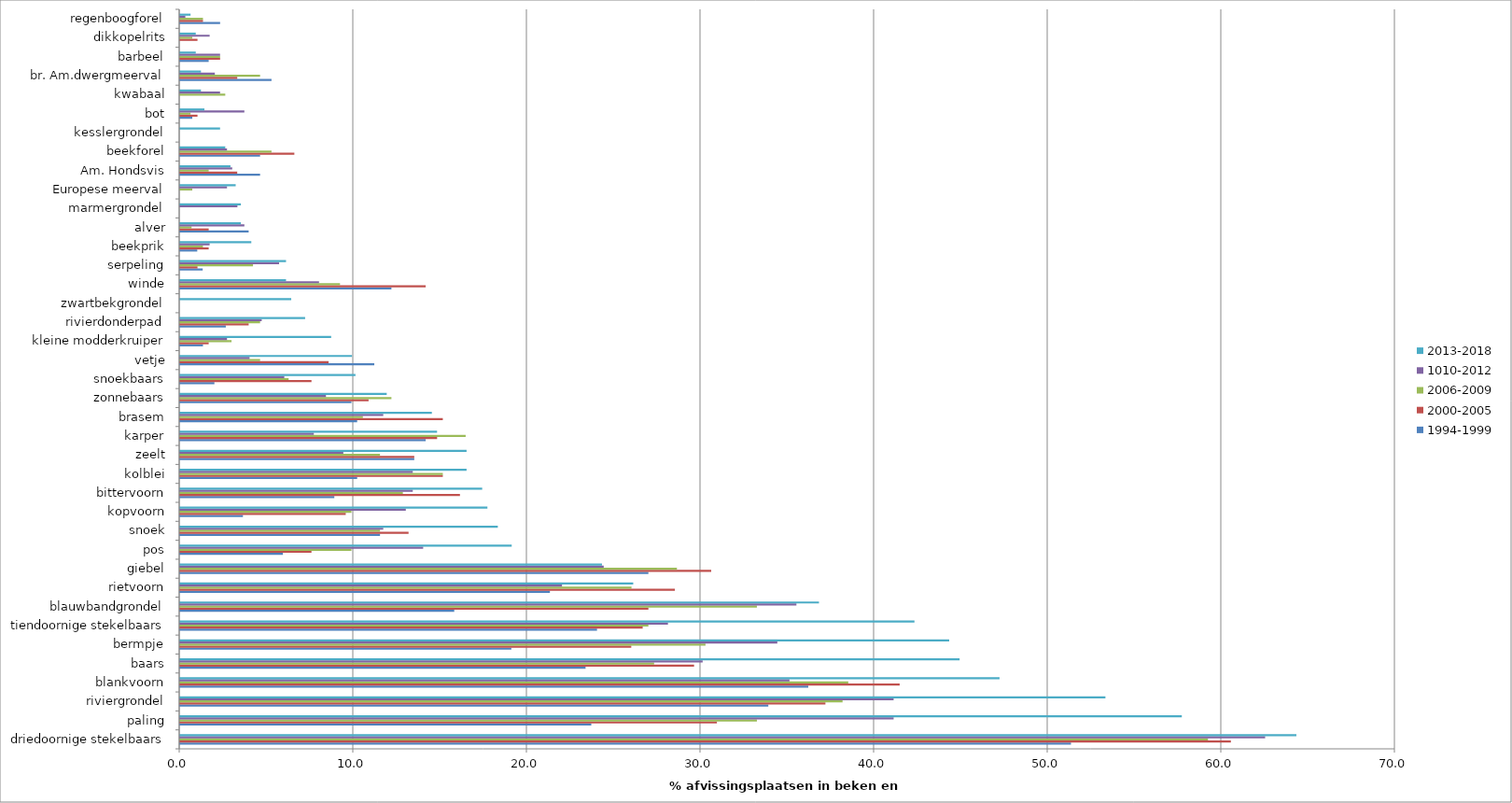
| Category | 1994-1999 | 2000-2005 | 2006-2009 | 1010-2012 | 2013-2018 |
|---|---|---|---|---|---|
| driedoornige stekelbaars | 51.316 | 60.526 | 59.211 | 62.5 | 64.3 |
| paling | 23.684 | 30.921 | 33.224 | 41.1 | 57.7 |
| riviergrondel | 33.882 | 37.171 | 38.158 | 41.1 | 53.3 |
| blankvoorn | 36.184 | 41.447 | 38.487 | 35.1 | 47.2 |
| baars | 23.355 | 29.605 | 27.303 | 30.1 | 44.9 |
| bermpje | 19.079 | 25.987 | 30.263 | 34.4 | 44.3 |
| tiendoornige stekelbaars | 24.013 | 26.645 | 26.974 | 28.1 | 42.3 |
| blauwbandgrondel | 15.789 | 26.974 | 33.224 | 35.5 | 36.8 |
| rietvoorn | 21.3 | 28.5 | 26 | 22 | 26.1 |
| giebel | 26.974 | 30.592 | 28.618 | 24.4 | 24.3 |
| pos | 5.921 | 7.566 | 9.868 | 14 | 19.1 |
| snoek | 11.513 | 13.158 | 11.513 | 11.7 | 18.3 |
| kopvoorn | 3.618 | 9.539 | 9.868 | 13 | 17.7 |
| bittervoorn | 8.882 | 16.118 | 12.829 | 13.4 | 17.4 |
| kolblei | 10.197 | 15.132 | 15.132 | 13.4 | 16.5 |
| zeelt | 13.487 | 13.487 | 11.513 | 9.4 | 16.5 |
| karper | 14.145 | 14.803 | 16.447 | 7.7 | 14.8 |
| brasem | 10.197 | 15.132 | 10.526 | 11.7 | 14.5 |
| zonnebaars | 9.868 | 10.855 | 12.171 | 8.4 | 11.9 |
| snoekbaars | 1.974 | 7.566 | 6.25 | 6 | 10.1 |
| vetje | 11.184 | 8.553 | 4.605 | 4 | 9.9 |
| kleine modderkruiper | 1.316 | 1.645 | 2.961 | 2.7 | 8.7 |
| rivierdonderpad | 2.632 | 3.947 | 4.605 | 4.7 | 7.2 |
| zwartbekgrondel | 0 | 0 | 0 | 0 | 6.4 |
| winde | 12.171 | 14.145 | 9.211 | 8 | 6.1 |
| serpeling | 1.3 | 1 | 4.2 | 5.7 | 6.1 |
| beekprik | 0.987 | 1.645 | 1.316 | 1.7 | 4.1 |
| alver | 3.947 | 1.645 | 0.658 | 3.7 | 3.5 |
| marmergrondel | 0 | 0 | 0 | 3.3 | 3.5 |
| Europese meerval | 0 | 0 | 0.7 | 2.7 | 3.2 |
| Am. Hondsvis | 4.605 | 3.289 | 1.645 | 3 | 2.9 |
| beekforel | 4.605 | 6.579 | 5.263 | 2.7 | 2.6 |
| kesslergrondel | 0 | 0 | 0 | 0 | 2.3 |
| bot | 0.7 | 1 | 0.6 | 3.7 | 1.4 |
| kwabaal | 0 | 0 | 2.6 | 2.3 | 1.2 |
| br. Am.dwergmeerval | 5.263 | 3.289 | 4.605 | 2 | 1.2 |
| barbeel | 1.645 | 2.303 | 2.303 | 2.3 | 0.9 |
| dikkopelrits | 0 | 1 | 0.7 | 1.7 | 0.9 |
| regenboogforel | 2.303 | 1.316 | 1.316 | 0.3 | 0.6 |